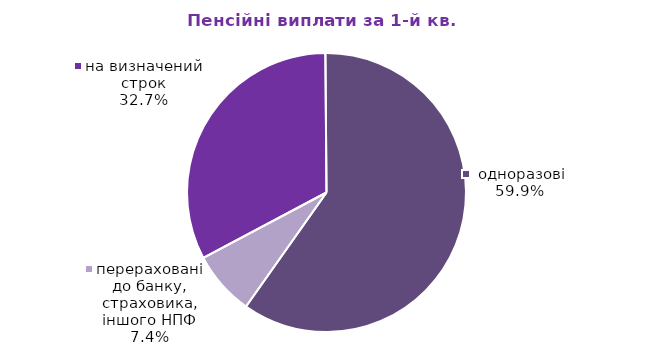
| Category | Series 0 |
|---|---|
| на визначений строк | 5534681.34 |
|  одноразові | 10155549.28 |
| перераховані до банку, страховика, іншого НПФ | 1260945.42 |